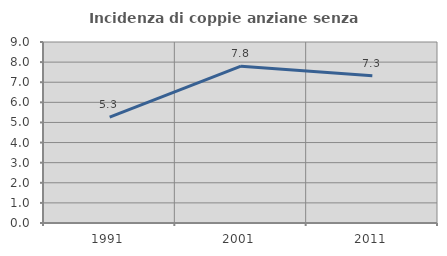
| Category | Incidenza di coppie anziane senza figli  |
|---|---|
| 1991.0 | 5.263 |
| 2001.0 | 7.799 |
| 2011.0 | 7.325 |